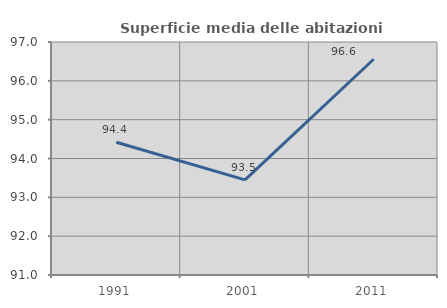
| Category | Superficie media delle abitazioni occupate |
|---|---|
| 1991.0 | 94.417 |
| 2001.0 | 93.451 |
| 2011.0 | 96.556 |